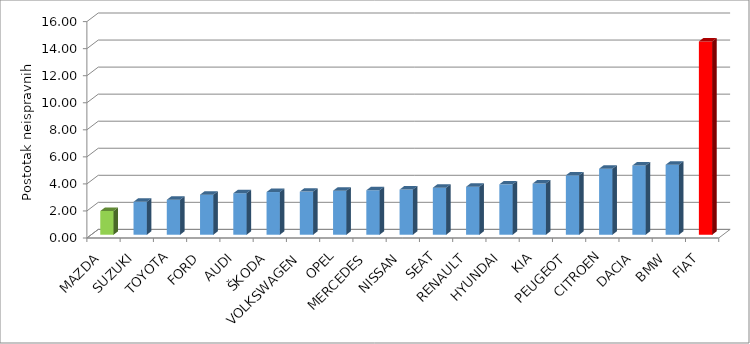
| Category | Series 4 |
|---|---|
| MAZDA | 1.753 |
| SUZUKI | 2.435 |
| TOYOTA | 2.585 |
| FORD | 2.961 |
| AUDI | 3.068 |
| ŠKODA | 3.156 |
| VOLKSWAGEN | 3.188 |
| OPEL | 3.252 |
| MERCEDES | 3.287 |
| NISSAN | 3.339 |
| SEAT | 3.475 |
| RENAULT | 3.548 |
| HYUNDAI | 3.725 |
| KIA | 3.785 |
| PEUGEOT | 4.391 |
| CITROEN | 4.881 |
| DACIA | 5.118 |
| BMW | 5.174 |
| FIAT | 14.291 |